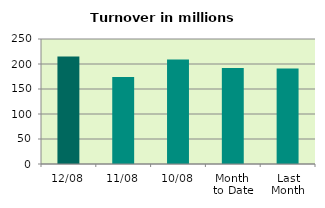
| Category | Series 0 |
|---|---|
| 12/08 | 214.963 |
| 11/08 | 174.227 |
| 10/08 | 209.13 |
| Month 
to Date | 191.795 |
| Last
Month | 191.038 |